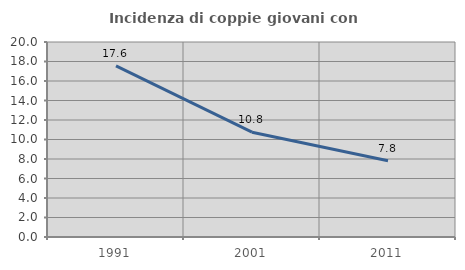
| Category | Incidenza di coppie giovani con figli |
|---|---|
| 1991.0 | 17.553 |
| 2001.0 | 10.753 |
| 2011.0 | 7.812 |